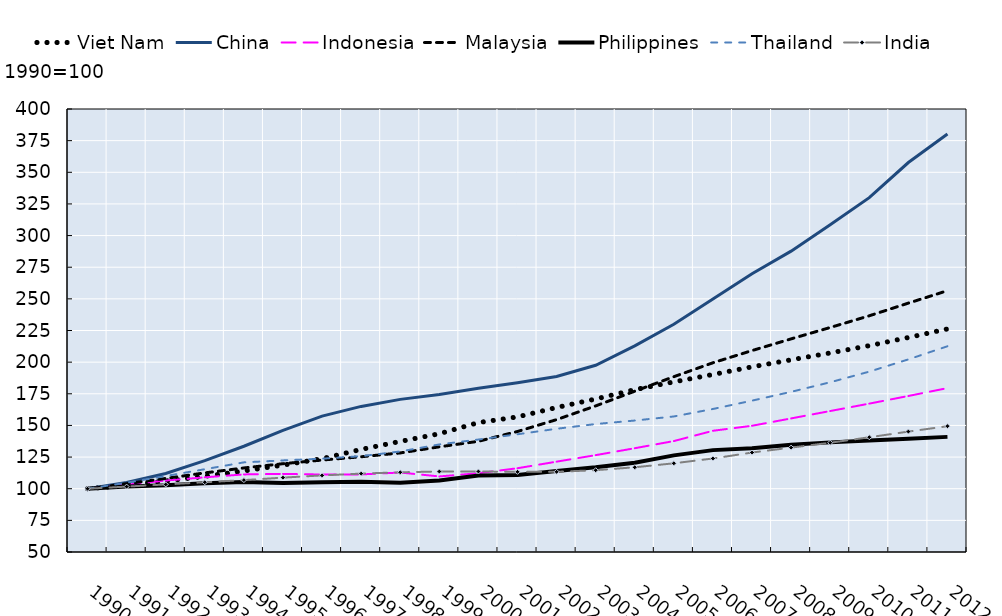
| Category | Viet Nam | China | Indonesia | Malaysia | Philippines | Thailand | India |
|---|---|---|---|---|---|---|---|
| 1990.0 | 100 | 100 | 100 | 100 | 100 | 100 | 100 |
| 1991.0 | 102.676 | 104.852 | 103.178 | 103.938 | 101.759 | 104.745 | 101.666 |
| 1992.0 | 106.02 | 112.061 | 106.442 | 108.124 | 102.706 | 110.023 | 103.378 |
| 1993.0 | 109.826 | 122.183 | 109.006 | 112.493 | 104.412 | 115.408 | 105.109 |
| 1994.0 | 114.035 | 133.546 | 111.304 | 116.407 | 105.337 | 120.81 | 106.797 |
| 1995.0 | 118.666 | 146.068 | 111.713 | 119.766 | 104.51 | 122.359 | 108.753 |
| 1996.0 | 123.688 | 157.392 | 111.222 | 122.633 | 105.045 | 123.741 | 110.52 |
| 1997.0 | 131.077 | 165.029 | 111.301 | 125.239 | 105.407 | 125.704 | 111.931 |
| 1998.0 | 137.379 | 170.58 | 112.787 | 128.272 | 104.719 | 129.435 | 112.991 |
| 1999.0 | 143.433 | 174.389 | 109.701 | 133.096 | 106.495 | 134.982 | 113.585 |
| 2000.0 | 152.253 | 179.403 | 112.236 | 137.466 | 110.389 | 138.849 | 113.624 |
| 2001.0 | 156.739 | 183.736 | 116.184 | 145.209 | 110.917 | 143.019 | 113.315 |
| 2002.0 | 164.161 | 188.685 | 121.38 | 154.595 | 113.997 | 147.352 | 113.342 |
| 2003.0 | 170.88 | 197.523 | 126.524 | 165.415 | 116.89 | 151.099 | 114.625 |
| 2004.0 | 178.266 | 212.807 | 131.995 | 177.036 | 120.586 | 153.863 | 116.938 |
| 2005.0 | 184.407 | 229.918 | 137.647 | 188.514 | 126.327 | 157.092 | 120.075 |
| 2006.0 | 190.242 | 249.904 | 145.77 | 199.507 | 130.489 | 162.99 | 123.883 |
| 2007.0 | 196.272 | 269.843 | 149.731 | 209.128 | 131.909 | 169.575 | 128.579 |
| 2008.0 | 201.812 | 287.695 | 155.537 | 218.383 | 134.664 | 176.542 | 132.476 |
| 2009.0 | 207.254 | 308.62 | 161.374 | 227.359 | 136.614 | 184.092 | 136.308 |
| 2010.0 | 213.041 | 329.982 | 167.234 | 236.619 | 138.07 | 192.502 | 140.651 |
| 2011.0 | 219.442 | 357.705 | 173.271 | 246.632 | 139.488 | 202.182 | 145.132 |
| 2012.0 | 226.242 | 380.31 | 179.499 | 256.466 | 140.957 | 212.558 | 149.389 |